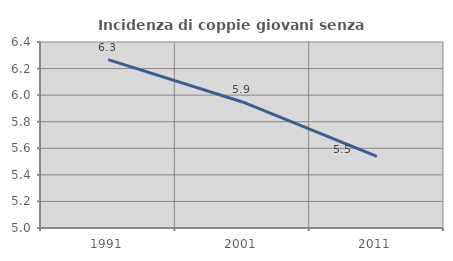
| Category | Incidenza di coppie giovani senza figli |
|---|---|
| 1991.0 | 6.267 |
| 2001.0 | 5.949 |
| 2011.0 | 5.539 |